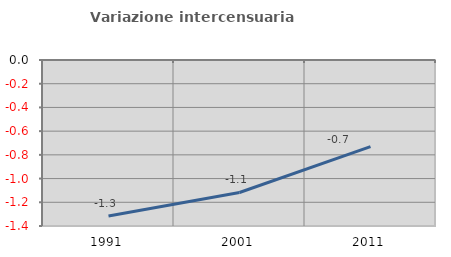
| Category | Variazione intercensuaria annua |
|---|---|
| 1991.0 | -1.316 |
| 2001.0 | -1.117 |
| 2011.0 | -0.731 |